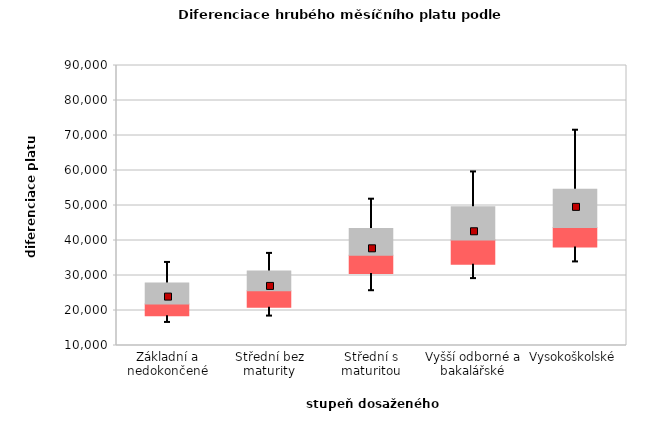
| Category | 0.25 | 0.5 | 0.75 |
|---|---|---|---|
| Základní a nedokončené | 18471.498 | 3381.502 | 6036.791 |
| Střední bez maturity | 20918.924 | 4753.076 | 5585.081 |
| Střední s maturitou | 30573.356 | 5222.155 | 7606.063 |
| Vyšší odborné a bakalářské | 33202.164 | 6932.484 | 9497.321 |
| Vysokoškolské | 38169.491 | 5527.699 | 10938.665 |